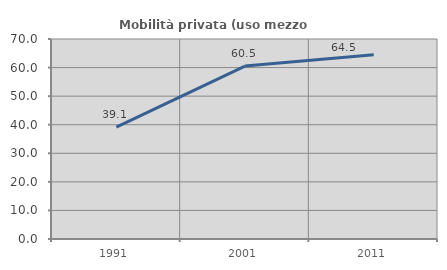
| Category | Mobilità privata (uso mezzo privato) |
|---|---|
| 1991.0 | 39.139 |
| 2001.0 | 60.518 |
| 2011.0 | 64.47 |